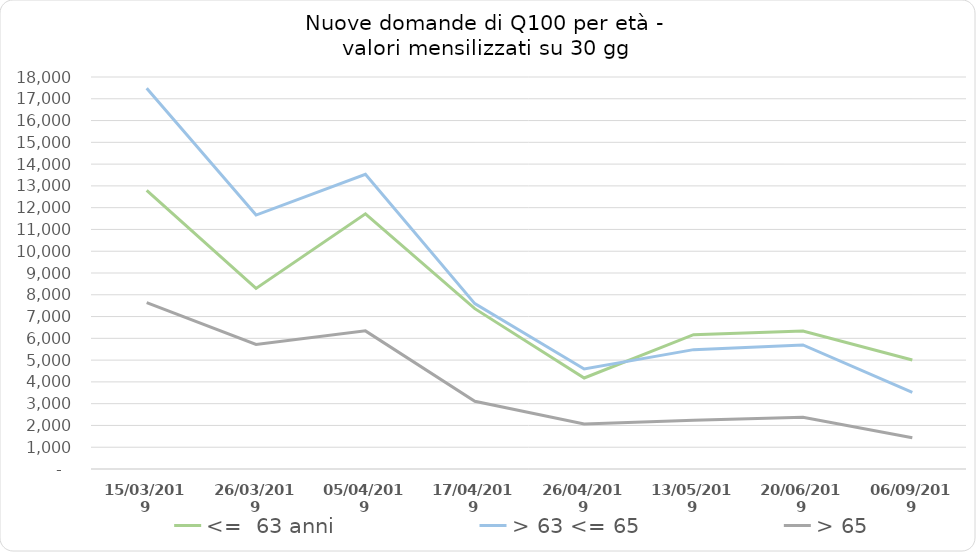
| Category | <=  63 anni | > 63 <= 65 | > 65 |
|---|---|---|---|
| 15/03/2019 | 12798.649 | 17487.568 | 7640.676 |
| 26/03/2019 | 8290.909 | 11659.091 | 5719.091 |
| 05/04/2019 | 11715 | 13533 | 6342 |
| 17/04/2019 | 7362.5 | 7595 | 3112.5 |
| 26/04/2019 | 4180 | 4593.333 | 2070 |
| 13/05/2019 | 6167.647 | 5481.176 | 2234.118 |
| 20/06/2019 | 6337.895 | 5695.263 | 2379.474 |
| 06/09/2019 | 5004.615 | 3518.846 | 1436.538 |